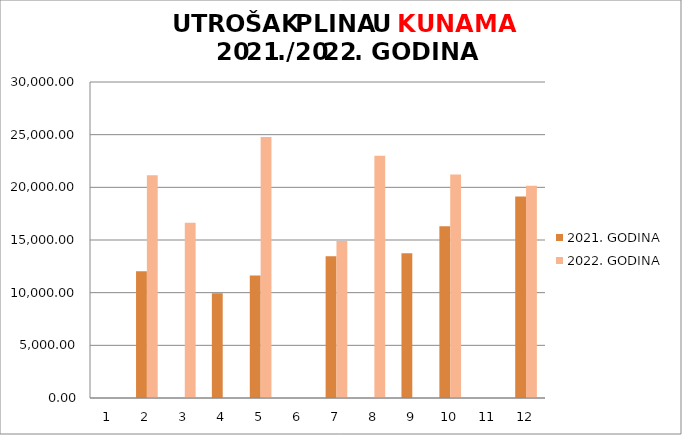
| Category | 2021. GODINA | 2022. GODINA |
|---|---|---|
| 0 | 0 | 0 |
| 1 | 12034.78 | 21150 |
| 2 | 0 | 16631.25 |
| 3 | 9936.39 | 0 |
| 4 | 11640 | 24787.39 |
| 5 | 0 | 0 |
| 6 | 13460 | 14896.2 |
| 7 | 0 | 23000 |
| 8 | 13737.15 | 0 |
| 9 | 16300 | 21225 |
| 10 | 0 | 0 |
| 11 | 19125 | 20140 |